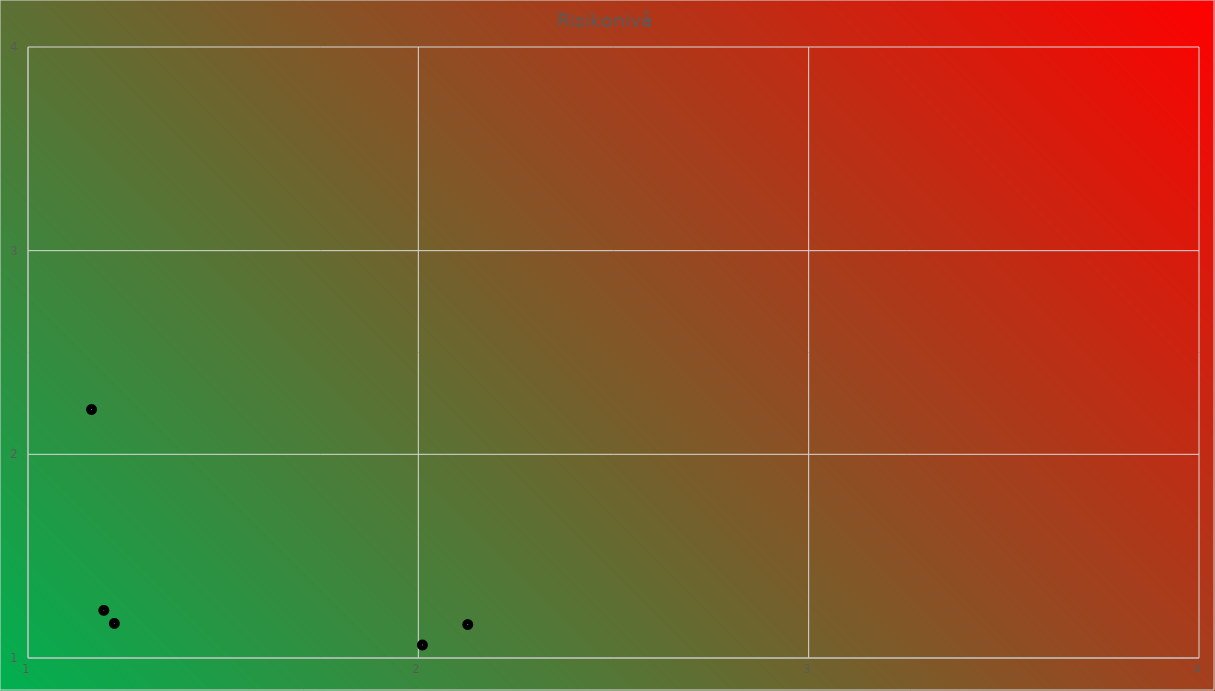
| Category | Risikoverdi |
|---|---|
| 2.126623734345712 | 1.164 |
| 2.0104280292716754 | 1.064 |
| 1.2212092334385194 | 1.17 |
| 1.1942540049901496 | 1.234 |
| 1.1627457358155577 | 2.22 |
| 0.04607618561636767 | 0.101 |
| 0.10313995531878958 | 0.155 |
| 0.12255047843930952 | 0.11 |
| 0.09186942702089435 | 0.109 |
| 0.1872260722020788 | 0.164 |
| 0.0411296781243799 | 0.172 |
| 0.057894915999821356 | 0.042 |
| 0.08321650950195245 | 0.233 |
| 0.07021577776059712 | 0.243 |
| 0.19659976289341613 | 0.207 |
| 0.21619547881551138 | 0.228 |
| 0.2059080314855724 | 0.008 |
| 0.12270071175200534 | 0.098 |
| 0.2210319630895904 | 0.11 |
| 0.00365292232508016 | 0.115 |
| 0.1920002089864962 | 0.086 |
| 0.14344974562576462 | 0.194 |
| 0.2082705878420545 | 0.036 |
| 0.24607457269511124 | 0.107 |
| 0.1923596440839511 | 0.071 |
| 0.17258958641118244 | 0.003 |
| 0.19557055793369052 | 0.204 |
| 0.20358144995167646 | 0.026 |
| 0.11915397078400289 | 0.125 |
| 0.07124850743816483 | 0.096 |
| 0.17569849115982386 | 0.146 |
| 0.19501757222635435 | 0.12 |
| 0.07476839940486346 | 0.113 |
| 0.13161036150911393 | 0.039 |
| 0.21156815601102713 | 0.099 |
| 0.06428878562142393 | 0.135 |
| 0.027258079517783085 | 0.156 |
| 0.1547069444481624 | 0.248 |
| 0.18705371822697028 | 0.23 |
| 0.08282394506241347 | 0.029 |
| 0.19604140834944805 | 0.086 |
| 0.08943868540327088 | 0.13 |
| 0.14102243708876572 | 0.213 |
| 0.07735710828728684 | 0.14 |
| 0.12111203062025694 | 0.198 |
| 0.09105850980503602 | 0.171 |
| 0.23158738316582697 | 0.112 |
| 0.03436038141746764 | 0.109 |